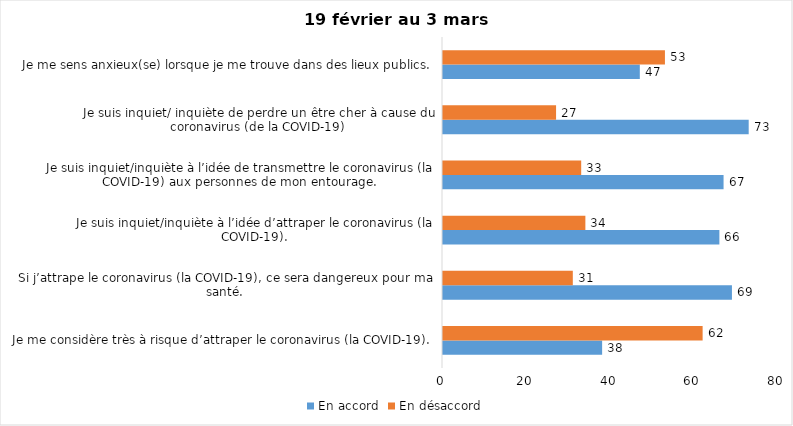
| Category | En accord | En désaccord |
|---|---|---|
| Je me considère très à risque d’attraper le coronavirus (la COVID-19). | 38 | 62 |
| Si j’attrape le coronavirus (la COVID-19), ce sera dangereux pour ma santé. | 69 | 31 |
| Je suis inquiet/inquiète à l’idée d’attraper le coronavirus (la COVID-19). | 66 | 34 |
| Je suis inquiet/inquiète à l’idée de transmettre le coronavirus (la COVID-19) aux personnes de mon entourage. | 67 | 33 |
| Je suis inquiet/ inquiète de perdre un être cher à cause du coronavirus (de la COVID-19) | 73 | 27 |
| Je me sens anxieux(se) lorsque je me trouve dans des lieux publics. | 47 | 53 |